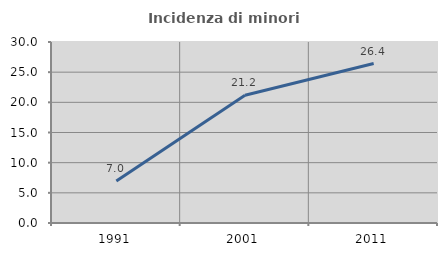
| Category | Incidenza di minori stranieri |
|---|---|
| 1991.0 | 6.977 |
| 2001.0 | 21.186 |
| 2011.0 | 26.426 |